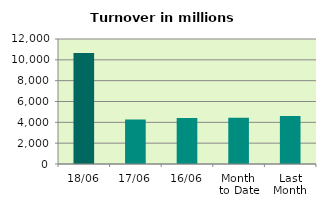
| Category | Series 0 |
|---|---|
| 18/06 | 10658.123 |
| 17/06 | 4268.774 |
| 16/06 | 4405.267 |
| Month 
to Date | 4429.522 |
| Last
Month | 4609.327 |